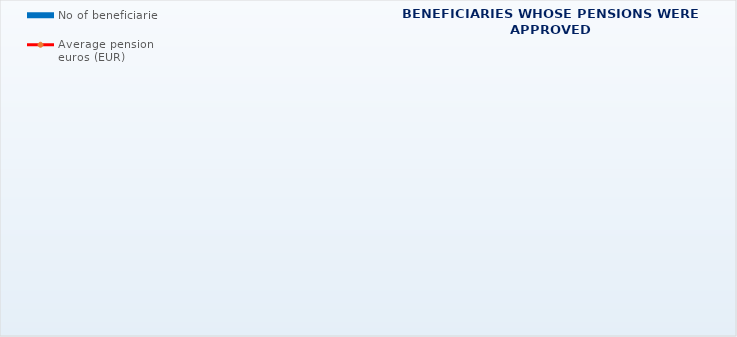
| Category | No of beneficiaries |
|---|---|
| Authorised officials in internal affairs, judicial officers and workers engaged in demining work: | 17264 |
| Pension beneficiaries entitled under the Fire Services Act (Official Gazette 125/19) | 352 |
| Active military personnel - DVO  | 16018 |
| Croatian Homeland Army veterans mobilised from 1941 to 1945 | 1895 |
| Former political prisoners | 2071 |
| Croatian Veterans from the Homeland War - ZOHBDR (Act on Croatian Homeland War Veterans and Their Family Members) | 71286 |
| Pensions approved under general regulations and determined according to the Act on the Rights of Croatian Homeland War Veterans and their Family Members (ZOHBDR), in 2017 (Art. 27, 35, 48 and 49, paragraph 2)    | 57409 |
| Former Yugoslav People's Army members - JNA   | 3653 |
| Former Yugoslav People's Army members - JNA - Art. 185 of Pension Insurance Act (ZOMO)  | 158 |
| National Liberation War veterans - NOR | 4950 |
| Members of the Croatian Parliament, members of the Government, judges of the Constitutional Court and the Auditor General | 680 |
| Members of the Parliamentary Executive Council and administratively retired federal civil servants  (relates to the former SFRY) | 65 |
| Former officials of federal bodies o the former SFRJ -  Article 38 of the Pension Insurance Act (ZOMO) | 17 |
| Full members of the Croatian Academy of Sciences and Arts - HAZU | 124 |
| Miners from the Istrian coal mines "Tupljak" d.d. Labin  | 244 |
| Workers professionally exposed to asbestos | 818 |
| Insurees - crew members on a ship in international and national navigation  - Article  129, paragraph 2 of the Maritime Code | 203 |
| Members of the Croatian Defence Council - HVO  | 6729 |